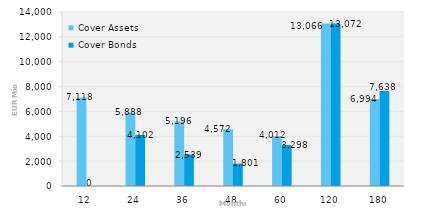
| Category | Cover Assets | Cover Bonds |
|---|---|---|
| 12.0 | 7117.507 | 0 |
| 24.0 | 5887.716 | 4102.349 |
| 36.0 | 5196.283 | 2539.1 |
| 48.0 | 4572.103 | 1801 |
| 60.0 | 4011.886 | 3297.622 |
| 120.0 | 13065.812 | 13071.653 |
| 180.0 | 6993.718 | 7637.962 |